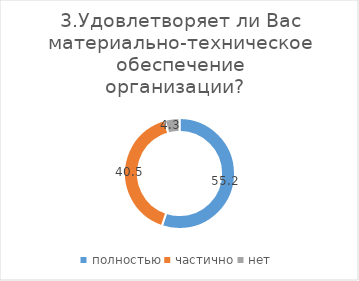
| Category | Series 0 |
|---|---|
| полностью | 55.172 |
| частично | 40.517 |
| нет | 4.31 |